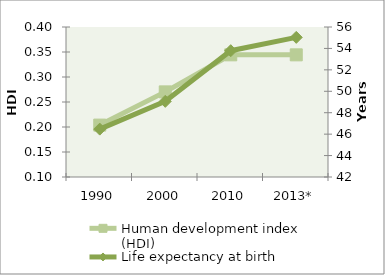
| Category | Human development index (HDI) |
|---|---|
| 1990 | 0.204 |
| 2000 | 0.27 |
| 2010 | 0.344 |
| 2013* | 0.344 |